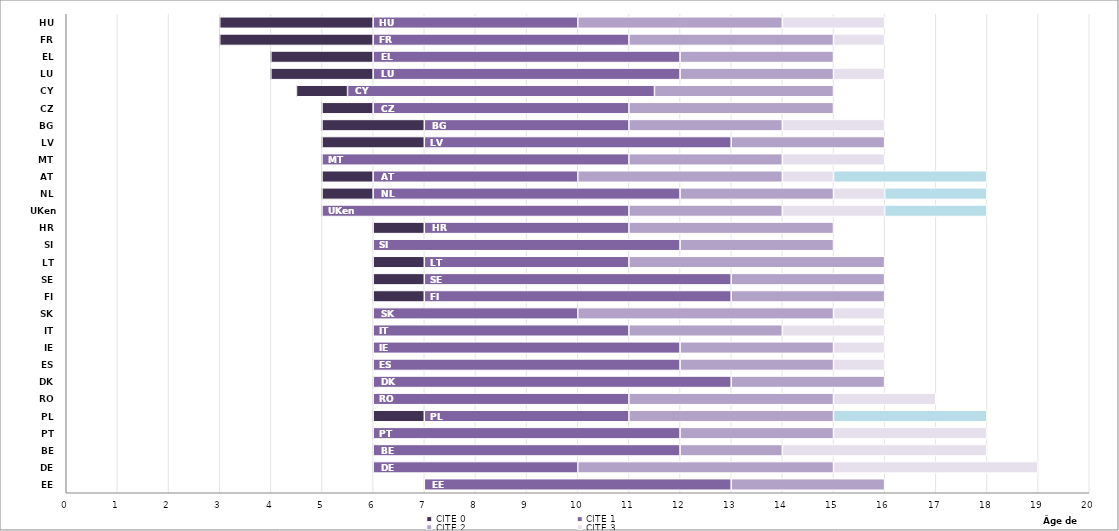
| Category | Âge d'instruction obligatoire | CITE 0 | CITE 1 | CITE 2 | CITE 3 | Obligation de formation |
|---|---|---|---|---|---|---|
| EE | 7 | 0 | 6 | 3 | 0 | 0 |
| DE | 6 | 0 | 4 | 5 | 4 | 0 |
| BE | 6 | 0 | 6 | 2 | 4 | 0 |
| PT | 6 | 0 | 6 | 3 | 3 | 0 |
| PL | 6 | 1 | 4 | 4 | 0 | 3 |
| RO | 6 | 0 | 5 | 4 | 2 | 0 |
| DK | 6 | 0 | 7 | 3 | 0 | 0 |
| ES | 6 | 0 | 6 | 3 | 1 | 0 |
| IE | 6 | 0 | 6 | 3 | 1 | 0 |
| IT | 6 | 0 | 5 | 3 | 2 | 0 |
| SK | 6 | 0 | 4 | 5 | 1 | 0 |
| FI | 6 | 1 | 6 | 3 | 0 | 0 |
| SE | 6 | 1 | 6 | 3 | 0 | 0 |
| LT | 6 | 1 | 4 | 5 | 0 | 0 |
| SI | 6 | 0 | 6 | 3 | 0 | 0 |
| HR | 6 | 1 | 4 | 4 | 0 | 0 |
| UKen | 5 | 0 | 6 | 3 | 2 | 2 |
| NL | 5 | 1 | 6 | 3 | 1 | 2 |
| AT | 5 | 1 | 4 | 4 | 1 | 3 |
| MT | 5 | 0 | 6 | 3 | 2 | 0 |
| LV | 5 | 2 | 6 | 3 | 0 | 0 |
| BG | 5 | 2 | 4 | 3 | 2 | 0 |
| CZ | 5 | 1 | 5 | 4 | 0 | 0 |
| CY | 4.5 | 1 | 6 | 3.5 | 0 | 0 |
| LU | 4 | 2 | 6 | 3 | 1 | 0 |
| EL | 4 | 2 | 6 | 3 | 0 | 0 |
| FR | 3 | 3 | 5 | 4 | 1 | 0 |
| HU | 3 | 3 | 4 | 4 | 2 | 0 |